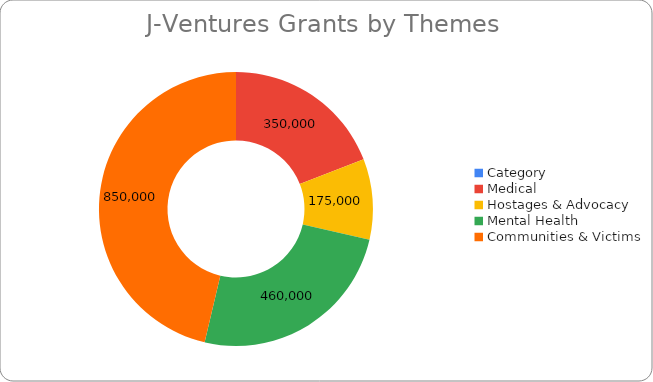
| Category | Series 0 |
|---|---|
| Category | 0 |
| Medical | 350000 |
| Hostages & Advocacy | 175000 |
| Mental Health | 460000 |
| Communities & Victims | 850000 |